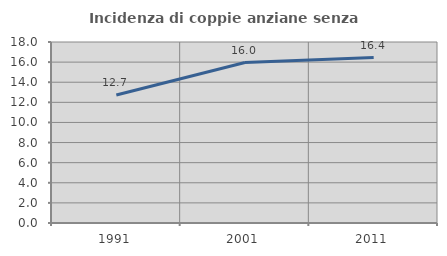
| Category | Incidenza di coppie anziane senza figli  |
|---|---|
| 1991.0 | 12.729 |
| 2001.0 | 15.961 |
| 2011.0 | 16.448 |